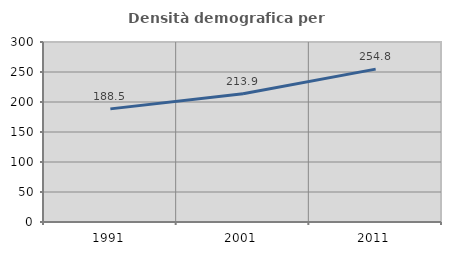
| Category | Densità demografica |
|---|---|
| 1991.0 | 188.528 |
| 2001.0 | 213.889 |
| 2011.0 | 254.805 |